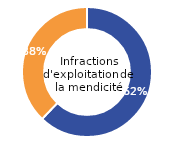
| Category | Infractions d'exploitation de la mendicité  |
|---|---|
| Femme | 62.15 |
| Homme | 37.85 |